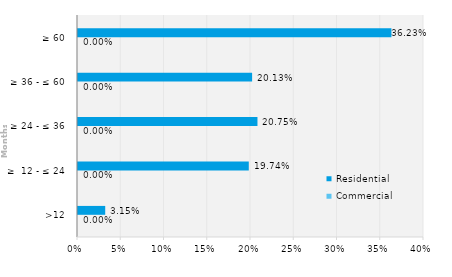
| Category | Commercial | Residential |
|---|---|---|
| >12 | 0 | 0.031 |
| ≥  12 - ≤ 24 | 0 | 0.197 |
| ≥ 24 - ≤ 36 | 0 | 0.207 |
| ≥ 36 - ≤ 60 | 0 | 0.201 |
| ≥ 60 | 0 | 0.362 |